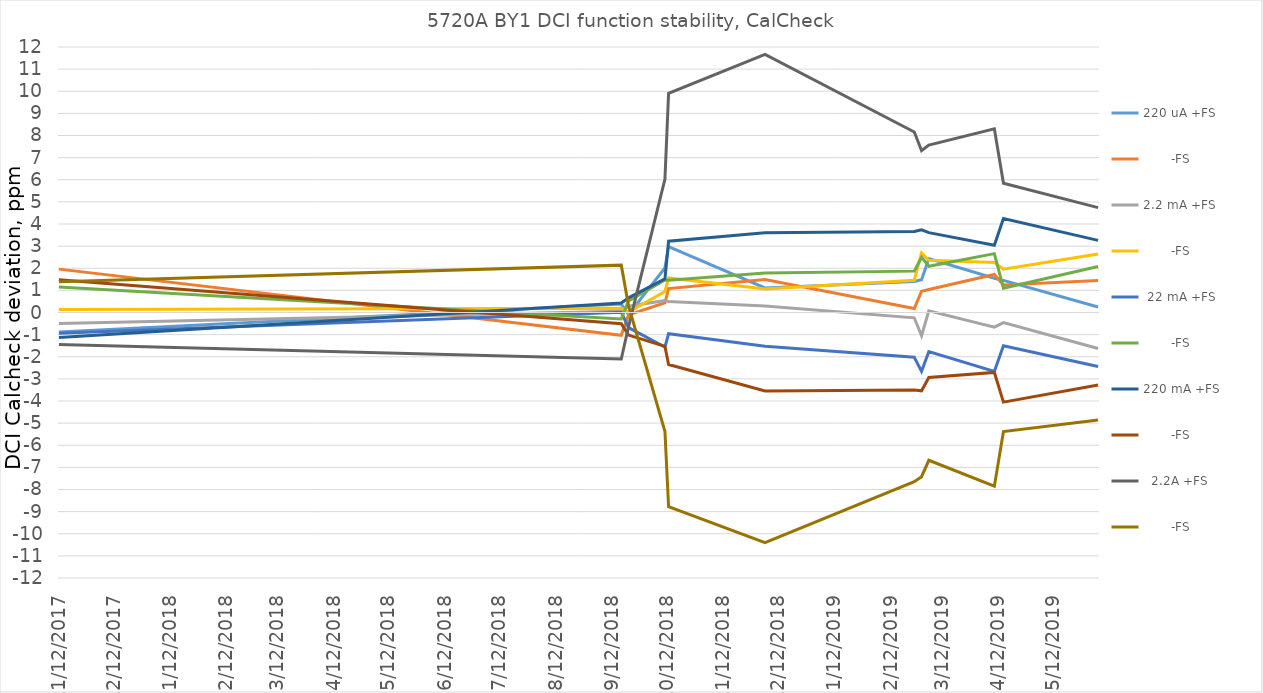
| Category | 220 uA +FS |        -FS | 2.2 mA +FS |  22 mA +FS | 220 mA +FS |   2.2A +FS |
|---|---|---|---|---|---|---|
| 11/12/17 | -0.88 | 1.39 | -0.5 | -0.94 | -1.13 | -1.45 |
| 9/17/18 | 0.38 | 2.14 | 0.06 | 0.01 | 0.43 | -2.1 |
| 9/21/18 | -0.09 | 0.3 | 0.28 | -0.68 | 0.66 | -0.64 |
| 10/11/18 | 2.02 | -5.38 | 0.54 | -1.56 | 1.52 | 6.03 |
| 10/13/18 | 2.98 | -8.78 | 0.5 | -0.96 | 3.22 | 9.91 |
| 12/5/18 | 1.11 | -10.4 | 0.29 | -1.53 | 3.6 | 11.67 |
| 2/25/19 | 1.4 | -7.65 | -0.24 | -2.02 | 3.66 | 8.16 |
| 3/1/19 | 1.48 | -7.42 | -1.05 | -2.66 | 3.74 | 7.32 |
| 3/5/19 | 2.44 | -6.68 | 0.08 | -1.77 | 3.61 | 7.57 |
| 4/10/19 | 1.55 | -7.85 | -0.66 | -2.66 | 3.04 | 8.3 |
| 4/15/19 | 1.45 | -5.38 | -0.46 | -1.5 | 4.25 | 5.84 |
| 6/6/19 | 0.25 | -4.86 | -1.63 | -2.44 | 3.26 | 4.74 |